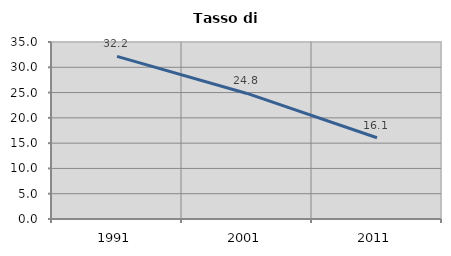
| Category | Tasso di disoccupazione   |
|---|---|
| 1991.0 | 32.16 |
| 2001.0 | 24.826 |
| 2011.0 | 16.07 |